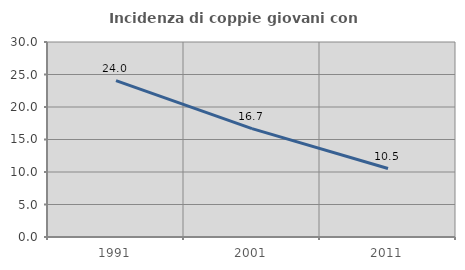
| Category | Incidenza di coppie giovani con figli |
|---|---|
| 1991.0 | 24.047 |
| 2001.0 | 16.667 |
| 2011.0 | 10.53 |